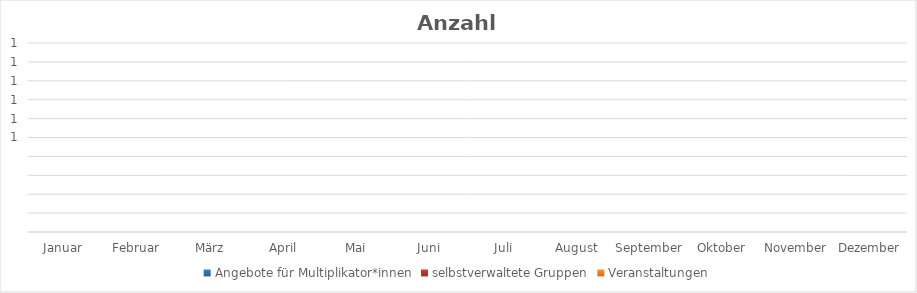
| Category | Angebote für Multiplikator*innen | selbstverwaltete Gruppen | Veranstaltungen |
|---|---|---|---|
| Januar | 0 | 0 | 0 |
| Februar | 0 | 0 | 0 |
| März | 0 | 0 | 0 |
| April | 0 | 0 | 0 |
| Mai | 0 | 0 | 0 |
| Juni | 0 | 0 | 0 |
| Juli | 0 | 0 | 0 |
| August | 0 | 0 | 0 |
| September | 0 | 0 | 0 |
| Oktober | 0 | 0 | 0 |
| November | 0 | 0 | 0 |
| Dezember | 0 | 0 | 0 |